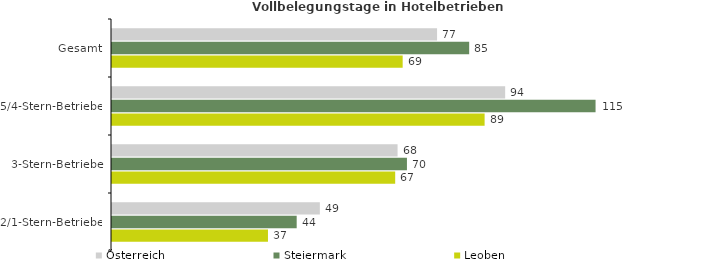
| Category | Österreich | Steiermark | Leoben |
|---|---|---|---|
| Gesamt | 77.394 | 85.042 | 69.206 |
| 5/4-Stern-Betriebe | 93.608 | 115.133 | 88.717 |
| 3-Stern-Betriebe | 67.992 | 70.225 | 67.427 |
| 2/1-Stern-Betriebe | 49.488 | 43.973 | 37.135 |